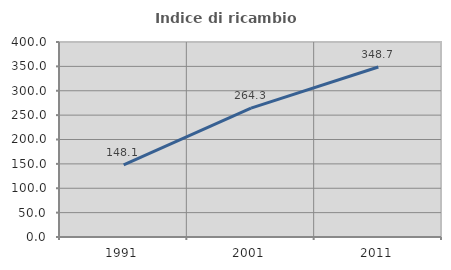
| Category | Indice di ricambio occupazionale  |
|---|---|
| 1991.0 | 148.148 |
| 2001.0 | 264.286 |
| 2011.0 | 348.718 |